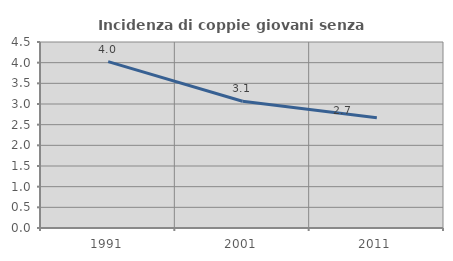
| Category | Incidenza di coppie giovani senza figli |
|---|---|
| 1991.0 | 4.025 |
| 2001.0 | 3.068 |
| 2011.0 | 2.669 |